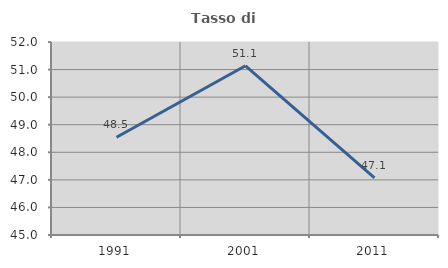
| Category | Tasso di occupazione   |
|---|---|
| 1991.0 | 48.545 |
| 2001.0 | 51.137 |
| 2011.0 | 47.071 |